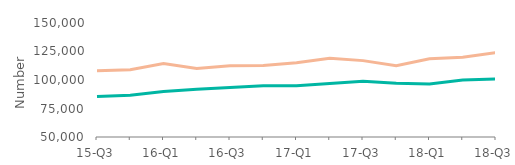
| Category | First-time
buyers | Home movers |
|---|---|---|
| 15-Q3 | 85450 | 108194.5 |
| 15-Q4 | 86652 | 109002 |
| 16-Q1 | 90000 | 114500 |
| 16-Q2 | 91800 | 110047.5 |
| 16-Q3 | 93450 | 112500 |
| 16-Q4 | 95000 | 112755 |
| 17-Q1 | 95000 | 115147.5 |
| 17-Q2 | 96950 | 119000 |
| 17-Q3 | 99000 | 117000 |
| 17-Q4 | 97200 | 112475 |
| 18-Q1 | 96450 | 118597.5 |
| 18-Q2 | 100000 | 120000 |
| 18-Q3 | 101000 | 123995 |